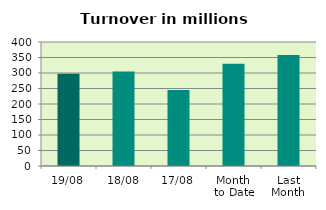
| Category | Series 0 |
|---|---|
| 19/08 | 297.549 |
| 18/08 | 304.968 |
| 17/08 | 245.431 |
| Month 
to Date | 329.653 |
| Last
Month | 357.784 |